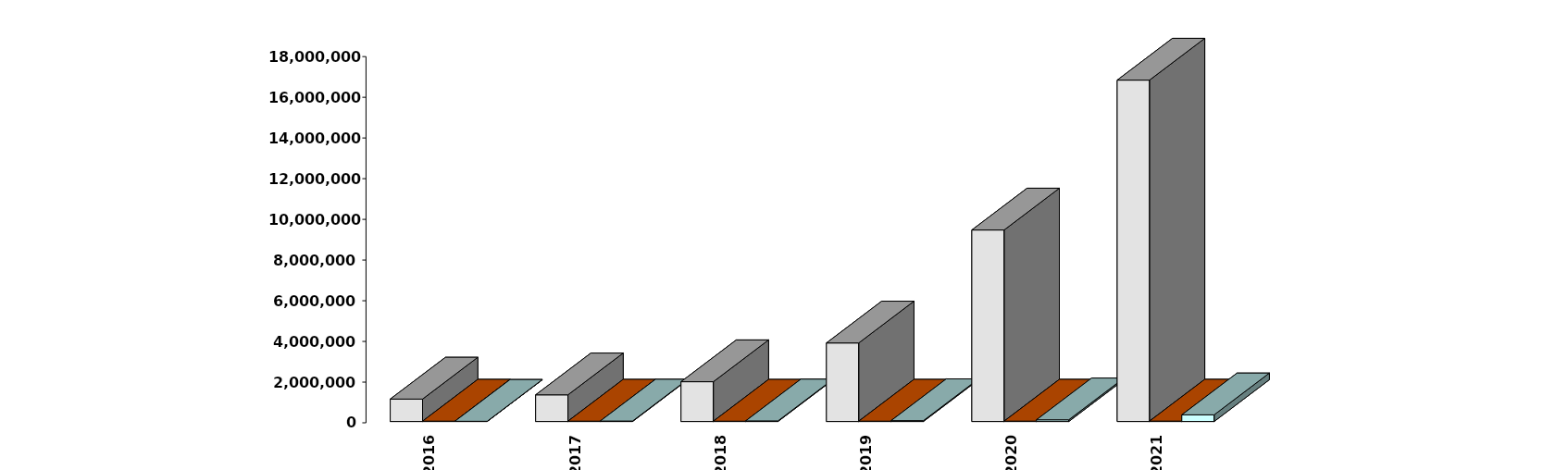
| Category | Физические лица | Юридические лица | Клиенты, передавшие свои средства в ДУ |
|---|---|---|---|
| 2016-12-31 | 1102966 | 18622 | 10694 |
| 2017-12-31 | 1310296 | 17766 | 22564 |
| 2018-12-31 | 1955118 | 16631 | 29262 |
| 2019-12-31 | 3859911 | 17695 | 41535 |
| 2020-12-31 | 9412672 | 19074 | 82193 |
| 2021-12-31 | 16779069 | 20446 | 327432 |